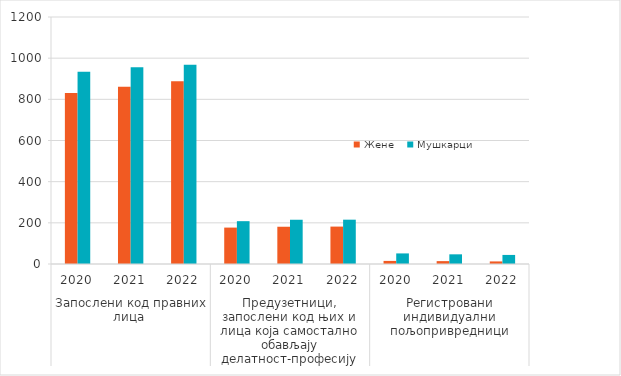
| Category | Жене | Мушкарци |
|---|---|---|
| 0 | 830.669 | 933.458 |
| 1 | 861 | 956 |
| 2 | 887.883 | 968.533 |
| 3 | 176.893 | 208.079 |
| 4 | 181 | 215 |
| 5 | 181.745 | 215.313 |
| 6 | 15 | 51.422 |
| 7 | 14 | 47 |
| 8 | 12.506 | 44.055 |